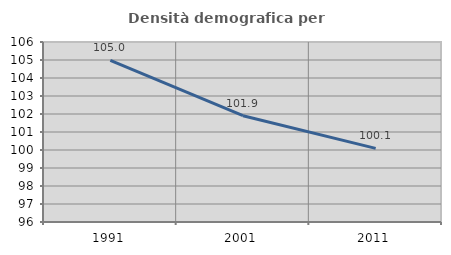
| Category | Densità demografica |
|---|---|
| 1991.0 | 104.98 |
| 2001.0 | 101.906 |
| 2011.0 | 100.091 |